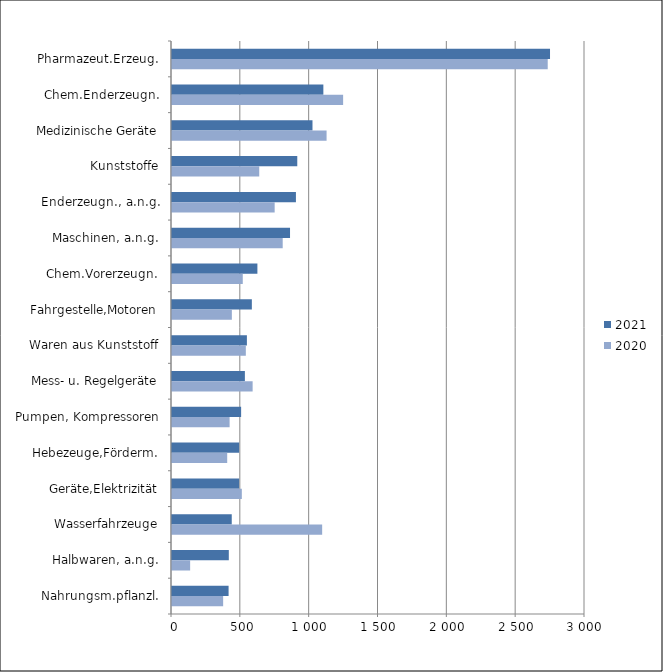
| Category | 2021 | 2020 |
|---|---|---|
| Pharmazeut.Erzeug. | 2745.896 | 2729.227 |
| Chem.Enderzeugn. | 1099.456 | 1243.048 |
| Medizinische Geräte | 1020.486 | 1122.849 |
| Kunststoffe | 909.971 | 633.7 |
| Enderzeugn., a.n.g. | 900.205 | 745.724 |
| Maschinen, a.n.g. | 857.368 | 804.111 |
| Chem.Vorerzeugn. | 620.322 | 514.09 |
| Fahrgestelle,Motoren | 580.039 | 434.793 |
| Waren aus Kunststoff | 544.029 | 536.291 |
| Mess- u. Regelgeräte | 529.429 | 585.681 |
| Pumpen, Kompressoren | 502.101 | 418.48 |
| Hebezeuge,Förderm. | 487.731 | 401.013 |
| Geräte,Elektrizität | 487.586 | 507.223 |
| Wasserfahrzeuge | 434.017 | 1090.753 |
| Halbwaren, a.n.g. | 412.681 | 131.762 |
| Nahrungsm.pflanzl. | 411.065 | 371.528 |